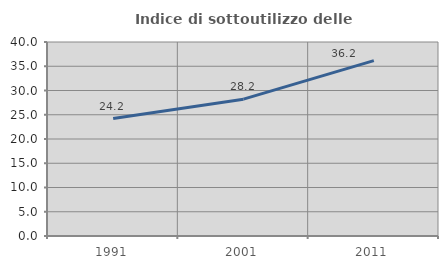
| Category | Indice di sottoutilizzo delle abitazioni  |
|---|---|
| 1991.0 | 24.219 |
| 2001.0 | 28.209 |
| 2011.0 | 36.154 |